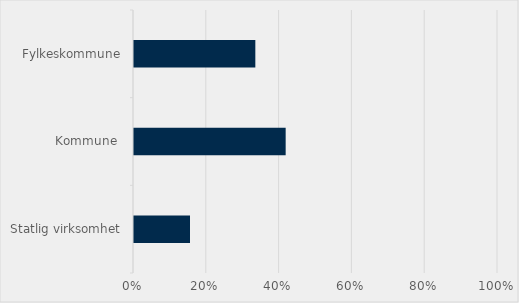
| Category | Series 0 |
|---|---|
| Statlig virksomhet | 0.154 |
| Kommune  | 0.417 |
| Fylkeskommune | 0.333 |